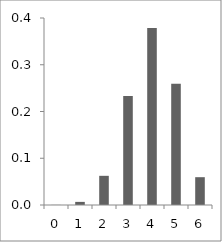
| Category | Series 0 |
|---|---|
| 0.0 | 0 |
| 1.0 | 0.007 |
| 2.0 | 0.062 |
| 3.0 | 0.233 |
| 4.0 | 0.379 |
| 5.0 | 0.26 |
| 6.0 | 0.059 |